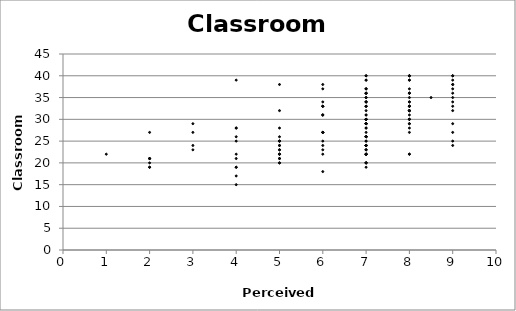
| Category | c_community |
|---|---|
| 7.0 | 23 |
| 7.0 | 22 |
| 5.0 | 23 |
| 7.0 | 23 |
| 5.0 | 22 |
| 8.0 | 32 |
| 7.0 | 24 |
| 6.0 | 22 |
| 5.0 | 28 |
| 5.0 | 25 |
| 7.0 | 22 |
| 6.0 | 23 |
| 9.0 | 33 |
| 2.0 | 19 |
| 5.0 | 38 |
| 6.0 | 27 |
| 7.0 | 19 |
| 7.0 | 24 |
| 4.0 | 15 |
| 7.0 | 32 |
| 7.0 | 26 |
| 7.0 | 20 |
| 5.0 | 24 |
| 7.0 | 29 |
| 3.0 | 23 |
| 8.0 | 32 |
| 8.0 | 22 |
| 8.0 | 36 |
| 6.0 | 18 |
| 4.0 | 26 |
| 5.0 | 22 |
| 5.0 | 25 |
| 2.0 | 27 |
| 5.0 | 26 |
| 9.0 | 34 |
| 8.0 | 33 |
| 9.0 | 35 |
| 8.0 | 27 |
| 7.0 | 29 |
| 2.0 | 20 |
| 7.0 | 28 |
| 4.0 | 19 |
| 4.0 | 25 |
| 6.0 | 27 |
| 8.0 | 37 |
| 6.0 | 24 |
| 4.0 | 28 |
| 6.0 | 31 |
| 8.0 | 32 |
| 5.0 | 21 |
| 7.0 | 29 |
| 8.0 | 35 |
| 3.0 | 27 |
| 8.0 | 29 |
| 8.0 | 30 |
| 7.0 | 26 |
| 7.0 | 26 |
| 7.0 | 26 |
| 7.0 | 30 |
| 7.0 | 22 |
| 7.0 | 31 |
| 4.0 | 21 |
| 8.0 | 40 |
| 8.0 | 32 |
| 8.0 | 39 |
| 8.0 | 30 |
| 7.0 | 22 |
| 7.0 | 30 |
| 5.0 | 20 |
| 7.0 | 23 |
| 6.0 | 33 |
| 2.0 | 21 |
| 5.0 | 32 |
| 7.0 | 24 |
| 5.0 | 20 |
| 7.0 | 24 |
| 7.0 | 29 |
| 7.0 | 27 |
| 5.0 | 25 |
| 3.0 | 24 |
| 7.0 | 33 |
| 6.0 | 25 |
| 7.0 | 24 |
| 7.0 | 34 |
| 7.0 | 30 |
| 7.0 | 36 |
| 6.0 | 27 |
| 8.0 | 34 |
| 8.0 | 29 |
| 7.0 | 37 |
| 9.0 | 39 |
| 8.0 | 33 |
| 7.0 | 28 |
| 9.0 | 38 |
| 8.0 | 40 |
| 9.0 | 27 |
| 7.0 | 29 |
| 9.0 | 37 |
| 9.0 | 40 |
| 8.0 | 36 |
| 8.5 | 35 |
| 7.0 | 39 |
| 6.0 | 33 |
| 9.0 | 24 |
| 3.0 | 29 |
| 8.0 | 32 |
| 7.0 | 37 |
| 6.0 | 31 |
| 4.0 | 17 |
| 5.0 | 23 |
| 7.0 | 20 |
| 8.0 | 22 |
| 5.0 | 24 |
| 7.0 | 20 |
| 9.0 | 29 |
| 7.0 | 36 |
| 4.0 | 28 |
| 8.0 | 36 |
| 7.0 | 22 |
| 7.0 | 26 |
| 7.0 | 31 |
| 6.0 | 38 |
| 7.0 | 36 |
| 7.0 | 37 |
| 7.0 | 34 |
| 8.0 | 34 |
| 7.0 | 35 |
| 7.0 | 39 |
| 8.0 | 33 |
| 7.0 | 40 |
| 6.0 | 37 |
| 4.0 | 19 |
| 9.0 | 38 |
| 7.0 | 36 |
| 7.0 | 40 |
| 9.0 | 40 |
| 7.0 | 34 |
| 8.0 | 33 |
| 7.0 | 30 |
| 6.0 | 27 |
| 8.0 | 28 |
| 9.0 | 32 |
| 1.0 | 22 |
| 9.0 | 36 |
| 5.0 | 21 |
| 9.0 | 25 |
| 6.0 | 34 |
| 7.0 | 25 |
| 7.0 | 20 |
| 7.0 | 34 |
| 7.0 | 22 |
| 5.0 | 22 |
| 7.0 | 30 |
| 8.0 | 31 |
| 2.0 | 19 |
| 6.0 | 31 |
| 7.0 | 25 |
| 4.0 | 22 |
| 8.0 | 30 |
| 2.0 | 21 |
| 7.0 | 35 |
| 8.0 | 40 |
| 7.0 | 33 |
| 4.0 | 39 |
| 8.0 | 39 |
| 7.0 | 33 |
| 6.0 | 33 |
| 2.0 | 21 |